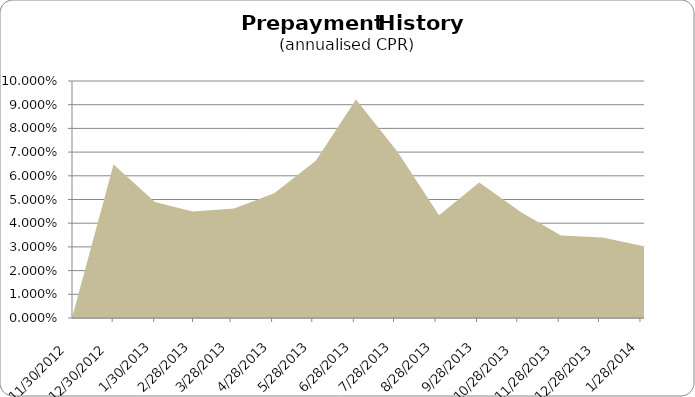
| Category | CPR |
|---|---|
| 11/30/12 | 0 |
| 12/31/12 | 0.065 |
| 1/31/13 | 0.049 |
| 2/28/13 | 0.045 |
| 3/31/13 | 0.046 |
| 4/30/13 | 0.053 |
| 5/31/13 | 0.066 |
| 6/30/13 | 0.092 |
| 7/31/13 | 0.07 |
| 8/31/13 | 0.043 |
| 9/30/13 | 0.057 |
| 10/31/13 | 0.045 |
| 11/30/13 | 0.035 |
| 12/31/13 | 0.034 |
| 1/31/14 | 0.03 |